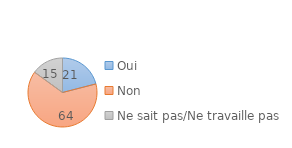
| Category | Series 0 |
|---|---|
| Oui | 21 |
| Non | 64 |
| Ne sait pas/Ne travaille pas | 15 |